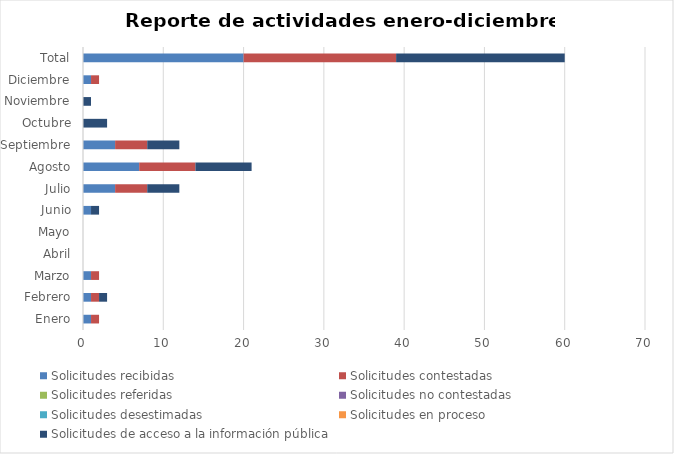
| Category | Solicitudes recibidas | Solicitudes contestadas | Solicitudes referidas | Solicitudes no contestadas | Solicitudes desestimadas | Solicitudes en proceso | Solicitudes de acceso a la información pública |
|---|---|---|---|---|---|---|---|
| Enero | 1 | 1 | 0 | 0 | 0 | 0 | 0 |
| Febrero | 1 | 1 | 0 | 0 | 0 | 0 | 1 |
| Marzo | 1 | 1 | 0 | 0 | 0 | 0 | 0 |
| Abril | 0 | 0 | 0 | 0 | 0 | 0 | 0 |
| Mayo | 0 | 0 | 0 | 0 | 0 | 0 | 0 |
| Junio | 1 | 0 | 0 | 0 | 0 | 0 | 1 |
| Julio | 4 | 4 | 0 | 0 | 0 | 0 | 4 |
| Agosto | 7 | 7 | 0 | 0 | 0 | 0 | 7 |
| Septiembre | 4 | 4 | 0 | 0 | 0 | 0 | 4 |
| Octubre | 0 | 0 | 0 | 0 | 0 | 0 | 3 |
| Noviembre | 0 | 0 | 0 | 0 | 0 | 0 | 1 |
| Diciembre | 1 | 1 | 0 | 0 | 0 | 0 | 0 |
| Total | 20 | 19 | 0 | 0 | 0 | 0 | 21 |